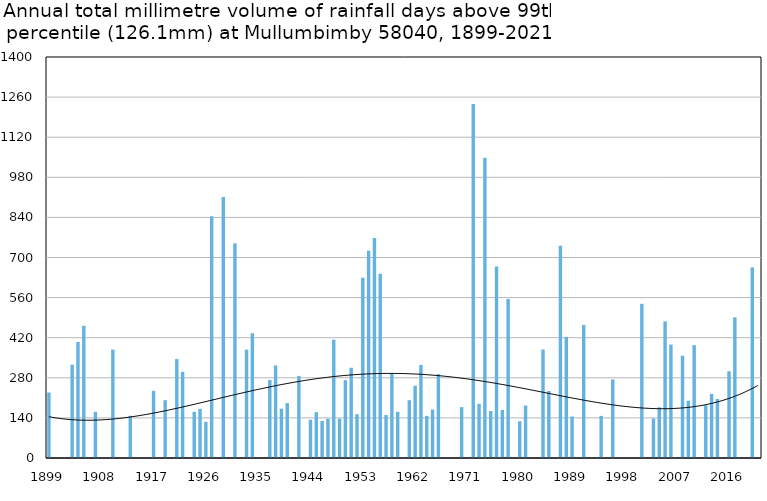
| Category | Annual total mm in days above 99th percentile |
|---|---|
| 1899 | 228.6 |
| 1900 | 0 |
| 1901 | 0 |
| 1902 | 0 |
| 1903 | 325.9 |
| 1904 | 405.2 |
| 1905 | 461.6 |
| 1906 | 0 |
| 1907 | 161.3 |
| 1908 | 0 |
| 1909 | 0 |
| 1910 | 378.4 |
| 1911 | 0 |
| 1912 | 0 |
| 1913 | 147.3 |
| 1914 | 0 |
| 1915 | 0 |
| 1916 | 0 |
| 1917 | 234.4 |
| 1918 | 0 |
| 1919 | 201.9 |
| 1920 | 0 |
| 1921 | 345.4 |
| 1922 | 300.7 |
| 1923 | 0 |
| 1924 | 161 |
| 1925 | 171.5 |
| 1926 | 126.2 |
| 1927 | 844 |
| 1928 | 0 |
| 1929 | 910.8 |
| 1930 | 0 |
| 1931 | 749.5 |
| 1932 | 0 |
| 1933 | 378.2 |
| 1934 | 435.6 |
| 1935 | 0 |
| 1936 | 0 |
| 1937 | 272.2 |
| 1938 | 323.1 |
| 1939 | 172.2 |
| 1940 | 191.8 |
| 1941 | 0 |
| 1942 | 286.7 |
| 1943 | 0 |
| 1944 | 133.6 |
| 1945 | 160 |
| 1946 | 129.5 |
| 1947 | 137.4 |
| 1948 | 413.2 |
| 1949 | 137.2 |
| 1950 | 271.8 |
| 1951 | 315.2 |
| 1952 | 152.9 |
| 1953 | 629.5 |
| 1954 | 723.4 |
| 1955 | 768.3 |
| 1956 | 643.2 |
| 1957 | 149.9 |
| 1958 | 294.7 |
| 1959 | 161.3 |
| 1960 | 0 |
| 1961 | 201.9 |
| 1962 | 252.2 |
| 1963 | 324.9 |
| 1964 | 146.8 |
| 1965 | 169.2 |
| 1966 | 292.8 |
| 1967 | 0 |
| 1968 | 0 |
| 1969 | 0 |
| 1970 | 177.5 |
| 1971 | 0 |
| 1972 | 1235.7 |
| 1973 | 189 |
| 1974 | 1048 |
| 1975 | 164 |
| 1976 | 669 |
| 1977 | 168 |
| 1978 | 555 |
| 1979 | 0 |
| 1980 | 128 |
| 1981 | 183 |
| 1982 | 0 |
| 1983 | 0 |
| 1984 | 379 |
| 1985 | 234 |
| 1986 | 0 |
| 1987 | 741 |
| 1988 | 423 |
| 1989 | 145 |
| 1990 | 0 |
| 1991 | 464 |
| 1992 | 0 |
| 1993 | 0 |
| 1994 | 147 |
| 1995 | 0 |
| 1996 | 274.2 |
| 1997 | 0 |
| 1998 | 0 |
| 1999 | 0 |
| 2000 | 0 |
| 2001 | 538.2 |
| 2002 | 0 |
| 2003 | 138 |
| 2004 | 177 |
| 2005 | 477 |
| 2006 | 396 |
| 2007 | 0 |
| 2008 | 357 |
| 2009 | 200 |
| 2010 | 394 |
| 2011 | 0 |
| 2012 | 184 |
| 2013 | 224 |
| 2014 | 206 |
| 2015 | 0 |
| 2016 | 303 |
| 2017 | 491 |
| 2018 | 0 |
| 2019 | 0 |
| 2020 | 665.4 |
| 2021 | 0 |